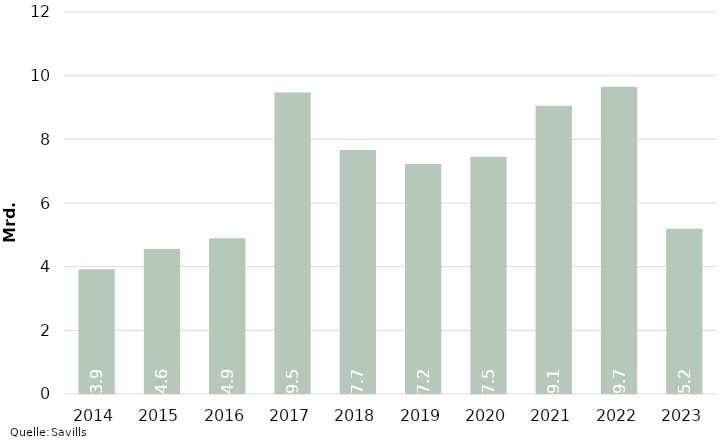
| Category | Series 1 |
|---|---|
| 2014 | 3920968980.31 |
| 2015 | 4557113724.92 |
| 2016 | 4890351002.13 |
| 2017 | 9470343512.7 |
| 2018 | 7666795490.35 |
| 2019 | 7226755920.45 |
| 2020 | 7453393031.54 |
| 2021 | 9058724684.96 |
| 2022 | 9652007449.94 |
| 2023 | 5188152566.92 |